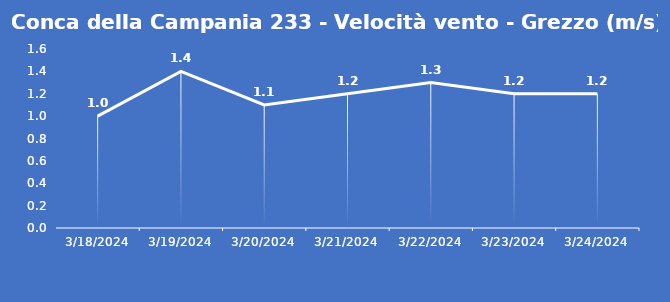
| Category | Conca della Campania 233 - Velocità vento - Grezzo (m/s) |
|---|---|
| 3/18/24 | 1 |
| 3/19/24 | 1.4 |
| 3/20/24 | 1.1 |
| 3/21/24 | 1.2 |
| 3/22/24 | 1.3 |
| 3/23/24 | 1.2 |
| 3/24/24 | 1.2 |